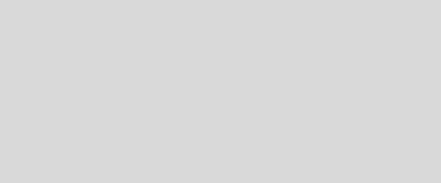
| Category | Series 0 | Series 1 | Series 2 |
|---|---|---|---|
| Main Occupation | 0 | 0 | 0 |
| Second Occupations | 0 | 0 | 0 |
| Employment History | 0 | 0 | 0 |
| Income Fluctuations | 0 | 0 | 0 |
| Self Employed History | 0 | 0 | 0 |
| Investment Income | 0 | 0 | 0 |
| Financial Concerns | 0 | 0 | 0 |